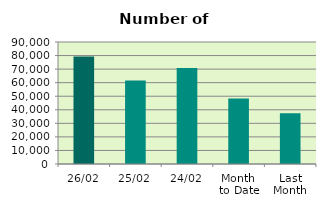
| Category | Series 0 |
|---|---|
| 26/02 | 79344 |
| 25/02 | 61672 |
| 24/02 | 70772 |
| Month 
to Date | 48274.222 |
| Last
Month | 37374.818 |